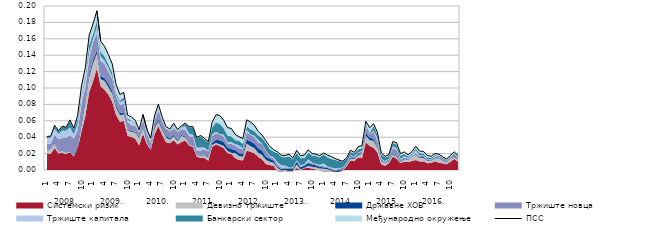
| Category | ПСС |
|---|---|
| 0 | 0.041 |
| 1 | 0.041 |
| 2 | 0.055 |
| 3 | 0.048 |
| 4 | 0.054 |
| 5 | 0.052 |
| 6 | 0.061 |
| 7 | 0.051 |
| 8 | 0.067 |
| 9 | 0.102 |
| 10 | 0.125 |
| 11 | 0.164 |
| 12 | 0.178 |
| 13 | 0.194 |
| 14 | 0.157 |
| 15 | 0.151 |
| 16 | 0.141 |
| 17 | 0.129 |
| 18 | 0.104 |
| 19 | 0.092 |
| 20 | 0.095 |
| 21 | 0.067 |
| 22 | 0.065 |
| 23 | 0.061 |
| 24 | 0.049 |
| 25 | 0.068 |
| 26 | 0.05 |
| 27 | 0.039 |
| 28 | 0.066 |
| 29 | 0.08 |
| 30 | 0.065 |
| 31 | 0.053 |
| 32 | 0.05 |
| 33 | 0.057 |
| 34 | 0.049 |
| 35 | 0.054 |
| 36 | 0.057 |
| 37 | 0.053 |
| 38 | 0.053 |
| 39 | 0.04 |
| 40 | 0.042 |
| 41 | 0.039 |
| 42 | 0.035 |
| 43 | 0.058 |
| 44 | 0.068 |
| 45 | 0.067 |
| 46 | 0.061 |
| 47 | 0.052 |
| 48 | 0.051 |
| 49 | 0.043 |
| 50 | 0.041 |
| 51 | 0.038 |
| 52 | 0.061 |
| 53 | 0.058 |
| 54 | 0.054 |
| 55 | 0.047 |
| 56 | 0.043 |
| 57 | 0.036 |
| 58 | 0.029 |
| 59 | 0.025 |
| 60 | 0.022 |
| 61 | 0.018 |
| 62 | 0.018 |
| 63 | 0.019 |
| 64 | 0.015 |
| 65 | 0.024 |
| 66 | 0.017 |
| 67 | 0.018 |
| 68 | 0.024 |
| 69 | 0.02 |
| 70 | 0.019 |
| 71 | 0.018 |
| 72 | 0.021 |
| 73 | 0.018 |
| 74 | 0.016 |
| 75 | 0.014 |
| 76 | 0.012 |
| 77 | 0.011 |
| 78 | 0.015 |
| 79 | 0.024 |
| 80 | 0.022 |
| 81 | 0.028 |
| 82 | 0.03 |
| 83 | 0.06 |
| 84 | 0.052 |
| 85 | 0.056 |
| 86 | 0.046 |
| 87 | 0.021 |
| 88 | 0.017 |
| 89 | 0.019 |
| 90 | 0.035 |
| 91 | 0.033 |
| 92 | 0.02 |
| 93 | 0.022 |
| 94 | 0.019 |
| 95 | 0.022 |
| 96 | 0.029 |
| 97 | 0.023 |
| 98 | 0.023 |
| 99 | 0.018 |
| 100 | 0.017 |
| 101 | 0.02 |
| 102 | 0.019 |
| 103 | 0.016 |
| 104 | 0.013 |
| 105 | 0.018 |
| 106 | 0.022 |
| 107 | 0.018 |